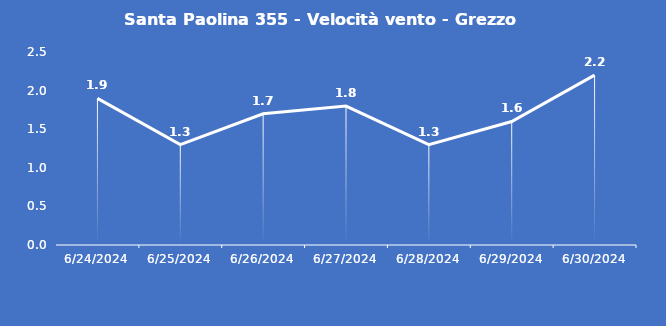
| Category | Santa Paolina 355 - Velocità vento - Grezzo (m/s) |
|---|---|
| 6/24/24 | 1.9 |
| 6/25/24 | 1.3 |
| 6/26/24 | 1.7 |
| 6/27/24 | 1.8 |
| 6/28/24 | 1.3 |
| 6/29/24 | 1.6 |
| 6/30/24 | 2.2 |